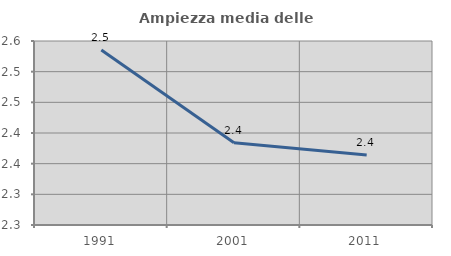
| Category | Ampiezza media delle famiglie |
|---|---|
| 1991.0 | 2.535 |
| 2001.0 | 2.384 |
| 2011.0 | 2.364 |